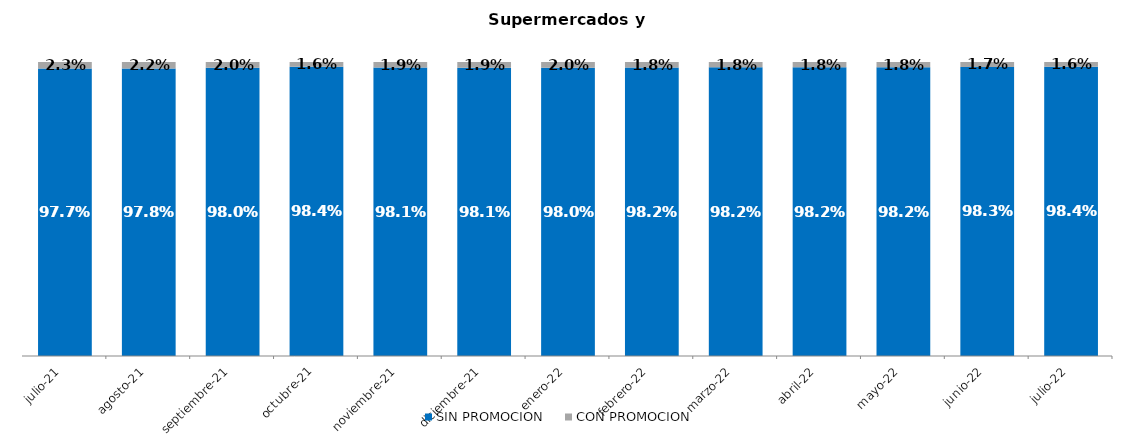
| Category | SIN PROMOCION   | CON PROMOCION   |
|---|---|---|
| 2021-07-01 | 0.977 | 0.023 |
| 2021-08-01 | 0.978 | 0.022 |
| 2021-09-01 | 0.98 | 0.02 |
| 2021-10-01 | 0.984 | 0.016 |
| 2021-11-01 | 0.981 | 0.019 |
| 2021-12-01 | 0.981 | 0.019 |
| 2022-01-01 | 0.98 | 0.02 |
| 2022-02-01 | 0.982 | 0.018 |
| 2022-03-01 | 0.982 | 0.018 |
| 2022-04-01 | 0.982 | 0.018 |
| 2022-05-01 | 0.982 | 0.018 |
| 2022-06-01 | 0.983 | 0.017 |
| 2022-07-01 | 0.984 | 0.016 |